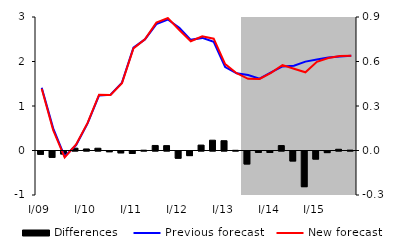
| Category | Differences |
|---|---|
| 0 | -0.022 |
| 1 | -0.043 |
| 2 | -0.02 |
| 3 | 0.016 |
| 4 | 0.01 |
| 5 | 0.015 |
| 6 | -0.005 |
| 7 | -0.012 |
| 8 | -0.017 |
| 9 | 0.002 |
| 10 | 0.034 |
| 11 | 0.033 |
| 12 | -0.049 |
| 13 | -0.031 |
| 14 | 0.037 |
| 15 | 0.069 |
| 16 | 0.066 |
| 17 | 0.001 |
| 18 | -0.087 |
| 19 | -0.009 |
| 20 | -0.01 |
| 21 | 0.033 |
| 22 | -0.067 |
| 23 | -0.24 |
| 24 | -0.054 |
| 25 | -0.011 |
| 26 | 0.008 |
| 27 | 0.002 |